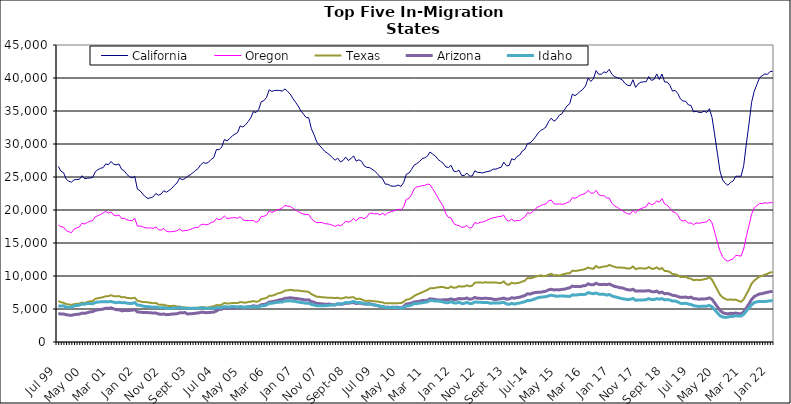
| Category | California | Oregon | Texas | Arizona | Idaho |
|---|---|---|---|---|---|
| Jul 99 | 26605 | 17749 | 6209 | 4339 | 5471 |
| Aug 99 | 25882 | 17447 | 6022 | 4228 | 5444 |
| Sep 99 | 25644 | 17401 | 5941 | 4237 | 5488 |
| Oct 99 | 24669 | 16875 | 5751 | 4134 | 5279 |
| Nov 99 | 24353 | 16701 | 5680 | 4073 | 5260 |
| Dec 99 | 24218 | 16570 | 5619 | 4042 | 5269 |
| Jan 00 | 24574 | 17109 | 5736 | 4142 | 5485 |
| Feb 00 | 24620 | 17295 | 5789 | 4192 | 5530 |
| Mar 00 | 24655 | 17436 | 5826 | 4226 | 5590 |
| Apr 00 | 25195 | 18009 | 5980 | 4375 | 5748 |
| May 00 | 24730 | 17875 | 5897 | 4337 | 5729 |
| Jun 00 | 24825 | 18113 | 6070 | 4444 | 5853 |
| Jul 00 | 24857 | 18294 | 6163 | 4555 | 5824 |
| Aug 00 | 24913 | 18376 | 6199 | 4603 | 5788 |
| Sep 00 | 25792 | 18971 | 6529 | 4804 | 5976 |
| Oct 00 | 26106 | 19135 | 6643 | 4870 | 6058 |
| Nov 00 | 26315 | 19306 | 6705 | 4926 | 6085 |
| Dec 00 | 26415 | 19570 | 6793 | 4991 | 6096 |
| Jan 01 | 26995 | 19781 | 6942 | 5122 | 6119 |
| Feb 01 | 26851 | 19519 | 6948 | 5089 | 6090 |
| Mar 01 | 27352 | 19720 | 7080 | 5180 | 6143 |
| Apr 01 | 26918 | 19221 | 6943 | 5020 | 6020 |
| May 01 | 26848 | 19126 | 6924 | 4899 | 5950 |
| Jun 01 | 26974 | 19241 | 6959 | 4895 | 6019 |
| Jul 01 | 26172 | 18725 | 6778 | 4737 | 5951 |
| Aug 01 | 25943 | 18736 | 6810 | 4757 | 5973 |
| Sep 01 | 25399 | 18514 | 6688 | 4753 | 5895 |
| Oct 01 | 25050 | 18415 | 6650 | 4780 | 5833 |
| Nov 01 | 24873 | 18381 | 6631 | 4826 | 5850 |
| Dec 01 | 25099 | 18765 | 6708 | 4898 | 5969 |
| Jan 02 | 23158 | 17561 | 6261 | 4560 | 5595 |
| Feb 02 | 22926 | 17573 | 6162 | 4531 | 5560 |
| Mar 02 | 22433 | 17452 | 6052 | 4481 | 5458 |
| Apr 02 | 22012 | 17314 | 6046 | 4458 | 5380 |
| May 02 | 21733 | 17267 | 6007 | 4452 | 5358 |
| Jun 02 | 21876 | 17298 | 5933 | 4444 | 5315 |
| Jul 02 | 21997 | 17209 | 5873 | 4383 | 5243 |
| Aug 02 | 22507 | 17436 | 5929 | 4407 | 5315 |
| Sep 02 | 22244 | 17010 | 5672 | 4248 | 5192 |
| Oct 02 | 22406 | 16952 | 5625 | 4191 | 5167 |
| Nov 02 | 22922 | 17223 | 5663 | 4242 | 5221 |
| Dec 02 | 22693 | 16770 | 5499 | 4142 | 5120 |
| Jan 03 | 22964 | 16694 | 5463 | 4166 | 5089 |
| Feb 03 | 23276 | 16727 | 5461 | 4226 | 5077 |
| Mar 03 | 23736 | 16766 | 5486 | 4251 | 5145 |
| Apr 03 | 24079 | 16859 | 5389 | 4289 | 5145 |
| May 03 | 24821 | 17117 | 5378 | 4415 | 5254 |
| Jun 03 | 24592 | 16812 | 5273 | 4426 | 5135 |
| Jul 03 | 24754 | 16875 | 5226 | 4466 | 5124 |
| Aug 03 | 25092 | 16922 | 5181 | 4244 | 5100 |
| Sep 03 | 25316 | 17036 | 5181 | 4279 | 5086 |
| Oct 03 | 25622 | 17228 | 5139 | 4301 | 5110 |
| Nov 03 | 25984 | 17335 | 5175 | 4362 | 5091 |
| Dec 03 | 26269 | 17350 | 5189 | 4396 | 5113 |
| Jan 04 | 26852 | 17734 | 5255 | 4492 | 5152 |
| Feb 04 | 27184 | 17860 | 5301 | 4502 | 5183 |
| Mar 04 | 27062 | 17757 | 5227 | 4443 | 5056 |
| Apr 04 | 27238 | 17840 | 5227 | 4461 | 5104 |
| May 04 | 27671 | 18113 | 5345 | 4493 | 5095 |
| Jun 04 | 27949 | 18201 | 5416 | 4532 | 5103 |
| Jul 04 | 29172 | 18727 | 5597 | 4697 | 5231 |
| Aug 04 | 29122 | 18529 | 5561 | 4945 | 5197 |
| Sep 04 | 29542 | 18678 | 5656 | 4976 | 5237 |
| Oct 04 | 30674 | 19108 | 5922 | 5188 | 5363 |
| Nov 04 | 30472 | 18716 | 5823 | 5106 | 5321 |
| Dec 04 | 30831 | 18755 | 5838 | 5135 | 5312 |
| Jan 05 | 31224 | 18823 | 5906 | 5155 | 5374 |
| Feb 05 | 31495 | 18842 | 5898 | 5168 | 5357 |
| Mar 05 | 31714 | 18738 | 5894 | 5212 | 5313 |
| Apr 05 | 32750 | 18998 | 6060 | 5340 | 5350 |
| May 05 | 32575 | 18504 | 5989 | 5269 | 5276 |
| Jun 05 | 32898 | 18414 | 5954 | 5252 | 5271 |
| Jul 05 | 33384 | 18395 | 6062 | 5322 | 5322 |
| Aug 05 | 33964 | 18381 | 6113 | 5375 | 5316 |
| Sep 05 | 34897 | 18426 | 6206 | 5493 | 5362 |
| Oct 05 | 34780 | 18132 | 6100 | 5408 | 5308 |
| Nov 05 | 35223 | 18332 | 6162 | 5434 | 5314 |
| Dec 05 | 36415 | 19047 | 6508 | 5658 | 5487 |
| Jan 06 | 36567 | 19032 | 6576 | 5688 | 5480 |
| Feb 06 | 37074 | 19257 | 6692 | 5792 | 5616 |
| Mar 06 | 38207 | 19845 | 6993 | 6052 | 5850 |
| Apr 06 | 37976 | 19637 | 7024 | 6101 | 5864 |
| May 06 | 38099 | 19781 | 7114 | 6178 | 5943 |
| Jun 06 | 38141 | 20061 | 7331 | 6276 | 6018 |
| Jul 06 | 38097 | 20111 | 7431 | 6399 | 6046 |
| Aug 06 | 38021 | 20333 | 7542 | 6450 | 6064 |
| Sep 06 | 38349 | 20686 | 7798 | 6627 | 6232 |
| Oct 06 | 37947 | 20591 | 7825 | 6647 | 6216 |
| Nov 06 | 37565 | 20526 | 7907 | 6707 | 6244 |
| Dec 06 | 36884 | 20272 | 7840 | 6648 | 6192 |
| Jan 07 | 36321 | 19984 | 7789 | 6597 | 6151 |
| Feb 07 | 35752 | 19752 | 7799 | 6554 | 6048 |
| Mar 07 | 35025 | 19547 | 7737 | 6487 | 5989 |
| Apr 07 | 34534 | 19412 | 7685 | 6430 | 5937 |
| May 07 | 34022 | 19296 | 7654 | 6353 | 5858 |
| Jun 07 | 33974 | 19318 | 7577 | 6390 | 5886 |
| Jul 07 | 32298 | 18677 | 7250 | 6117 | 5682 |
| Aug 07 | 31436 | 18322 | 7070 | 6034 | 5617 |
| Sep 07 | 30331 | 18087 | 6853 | 5847 | 5500 |
| Oct 07 | 29813 | 18108 | 6839 | 5821 | 5489 |
| Nov 07 | 29384 | 18105 | 6777 | 5769 | 5481 |
| Dec 07 | 28923 | 17949 | 6760 | 5733 | 5499 |
| Jan 08 | 28627 | 17890 | 6721 | 5732 | 5521 |
| Feb 08 | 28328 | 17834 | 6719 | 5749 | 5579 |
| Mar 08 | 27911 | 17680 | 6690 | 5650 | 5614 |
| Apr 08 | 27543 | 17512 | 6656 | 5612 | 5635 |
| May 08 | 27856 | 17754 | 6705 | 5774 | 5798 |
| Jun 08 | 27287 | 17589 | 6593 | 5717 | 5745 |
| Jul 08 | 27495 | 17834 | 6623 | 5761 | 5807 |
| Aug 08 | 28018 | 18309 | 6789 | 5867 | 5982 |
| Sep-08 | 27491 | 18164 | 6708 | 5864 | 5954 |
| Oct 08 | 27771 | 18291 | 6755 | 5942 | 6032 |
| Nov 08 | 28206 | 18706 | 6787 | 5970 | 6150 |
| Dec 08 | 27408 | 18353 | 6505 | 5832 | 5975 |
| Jan 09 | 27601 | 18778 | 6569 | 5890 | 5995 |
| Feb 09 | 27394 | 18863 | 6483 | 5845 | 5936 |
| Mar 09 | 26690 | 18694 | 6273 | 5751 | 5806 |
| Apr 09 | 26461 | 18943 | 6222 | 5735 | 5777 |
| May 09 | 26435 | 19470 | 6272 | 5819 | 5767 |
| Jun 09 | 26187 | 19522 | 6199 | 5700 | 5649 |
| Jul 09 | 25906 | 19408 | 6171 | 5603 | 5617 |
| Aug 09 | 25525 | 19469 | 6128 | 5533 | 5540 |
| Sep 09 | 25050 | 19249 | 6059 | 5405 | 5437 |
| Oct 09 | 24741 | 19529 | 6004 | 5349 | 5369 |
| Nov 09 | 23928 | 19187 | 5854 | 5271 | 5248 |
| Dec 09 | 23899 | 19607 | 5886 | 5261 | 5195 |
| Jan 10 | 23676 | 19703 | 5881 | 5232 | 5234 |
| Feb 10 | 23592 | 19845 | 5850 | 5272 | 5236 |
| Mar 10 | 23634 | 19946 | 5864 | 5278 | 5219 |
| Apr 10 | 23774 | 20134 | 5889 | 5257 | 5201 |
| May 10 | 23567 | 19966 | 5897 | 5172 | 5105 |
| Jun 10 | 24166 | 20464 | 6087 | 5356 | 5237 |
| Jul 10 | 25410 | 21627 | 6417 | 5742 | 5452 |
| Aug 10 | 25586 | 21744 | 6465 | 5797 | 5491 |
| Sep 10 | 26150 | 22314 | 6667 | 5907 | 5609 |
| Oct 10 | 26807 | 23219 | 6986 | 6070 | 5831 |
| Nov 10 | 27033 | 23520 | 7179 | 6100 | 5810 |
| Dec 10 | 27332 | 23551 | 7361 | 6182 | 5898 |
| Jan 11 | 27769 | 23697 | 7525 | 6276 | 5938 |
| Feb 11 | 27898 | 23718 | 7708 | 6267 | 6016 |
| Mar 11 | 28155 | 23921 | 7890 | 6330 | 6081 |
| Apr 11 | 28790 | 23847 | 8146 | 6544 | 6305 |
| May 11 | 28471 | 23215 | 8131 | 6502 | 6248 |
| Jun 11 | 28191 | 22580 | 8199 | 6445 | 6217 |
| Jul 11 | 27678 | 21867 | 8291 | 6368 | 6202 |
| Aug 11 | 27372 | 21203 | 8321 | 6356 | 6146 |
| Sep 11 | 27082 | 20570 | 8341 | 6387 | 6075 |
| Oct 11 | 26528 | 19442 | 8191 | 6402 | 5932 |
| Nov 11 | 26440 | 18872 | 8176 | 6426 | 5968 |
| Dec 11 | 26770 | 18784 | 8401 | 6533 | 6106 |
| Jan 12 | 25901 | 17963 | 8202 | 6390 | 5933 |
| Feb 12 | 25796 | 17718 | 8266 | 6456 | 5900 |
| Mar 12 | 26042 | 17647 | 8456 | 6600 | 6054 |
| Apr 12 | 25239 | 17386 | 8388 | 6534 | 5838 |
| May 12 | 25238 | 17407 | 8401 | 6558 | 5854 |
| Jun 12 | 25593 | 17673 | 8594 | 6669 | 6009 |
| Jul 12 | 25155 | 17237 | 8432 | 6474 | 5817 |
| Aug 12 | 25146 | 17391 | 8536 | 6539 | 5842 |
| Sep 12 | 25942 | 18102 | 8989 | 6759 | 6061 |
| Oct 12 | 25718 | 17953 | 9012 | 6618 | 6027 |
| Nov 12 | 25677 | 18134 | 9032 | 6611 | 6009 |
| Dec 12 | 25619 | 18166 | 8981 | 6601 | 5999 |
| Jan 13 | 25757 | 18344 | 9051 | 6627 | 5989 |
| Feb-13 | 25830 | 18512 | 9001 | 6606 | 5968 |
| Mar-13 | 25940 | 18689 | 9021 | 6577 | 5853 |
| Apr 13 | 26187 | 18844 | 9013 | 6478 | 5925 |
| May 13 | 26192 | 18884 | 9003 | 6431 | 5924 |
| Jun-13 | 26362 | 19013 | 8948 | 6508 | 5896 |
| Jul 13 | 26467 | 19037 | 8958 | 6559 | 5948 |
| Aug 13 | 27253 | 19198 | 9174 | 6655 | 6020 |
| Sep 13 | 26711 | 18501 | 8747 | 6489 | 5775 |
| Oct 13 | 26733 | 18301 | 8681 | 6511 | 5711 |
| Nov 13 | 27767 | 18620 | 8989 | 6709 | 5860 |
| Dec 13 | 27583 | 18320 | 8863 | 6637 | 5740 |
| Jan 14 | 28107 | 18409 | 8939 | 6735 | 5843 |
| Feb-14 | 28313 | 18383 | 8989 | 6779 | 5893 |
| Mar 14 | 28934 | 18696 | 9160 | 6918 | 6015 |
| Apr 14 | 29192 | 18946 | 9291 | 7036 | 6099 |
| May 14 | 30069 | 19603 | 9701 | 7314 | 6304 |
| Jun 14 | 30163 | 19487 | 9641 | 7252 | 6293 |
| Jul-14 | 30587 | 19754 | 9752 | 7415 | 6427 |
| Aug-14 | 31074 | 20201 | 9882 | 7499 | 6557 |
| Sep 14 | 31656 | 20459 | 9997 | 7536 | 6719 |
| Oct 14 | 32037 | 20663 | 10109 | 7555 | 6786 |
| Nov 14 | 32278 | 20825 | 9992 | 7628 | 6831 |
| Dec 14 | 32578 | 20918 | 10006 | 7705 | 6860 |
| Jan 15 | 33414 | 21396 | 10213 | 7906 | 7000 |
| Feb 15 | 33922 | 21518 | 10337 | 7982 | 7083 |
| Mar 15 | 33447 | 20942 | 10122 | 7891 | 7006 |
| Apr-15 | 33731 | 20893 | 10138 | 7906 | 6931 |
| May 15 | 34343 | 20902 | 10053 | 7895 | 6952 |
| Jun-15 | 34572 | 20870 | 10192 | 7973 | 6966 |
| Jul 15 | 35185 | 20916 | 10303 | 8000 | 6949 |
| Aug 15 | 35780 | 21115 | 10399 | 8126 | 6938 |
| Sep 15 | 36109 | 21246 | 10428 | 8207 | 6896 |
| Oct 15 | 37555 | 21908 | 10813 | 8477 | 7140 |
| Nov 15 | 37319 | 21750 | 10763 | 8390 | 7112 |
| Dec 15 | 37624 | 21990 | 10807 | 8395 | 7149 |
| Jan 16 | 37978 | 22248 | 10892 | 8388 | 7201 |
| Feb 16 | 38285 | 22369 | 10951 | 8508 | 7192 |
| Mar 16 | 38792 | 22506 | 11075 | 8547 | 7226 |
| Apr 16 | 39994 | 22999 | 11286 | 8815 | 7487 |
| May 16 | 39488 | 22548 | 11132 | 8673 | 7382 |
| Jun 16 | 39864 | 22556 | 11100 | 8682 | 7315 |
| Jul 16 | 41123 | 22989 | 11516 | 8903 | 7420 |
| Aug 16 | 40573 | 22333 | 11251 | 8731 | 7261 |
| Sep 16 | 40560 | 22162 | 11340 | 8692 | 7216 |
| Oct 16 | 40923 | 22172 | 11456 | 8742 | 7233 |
| Nov 16 | 40817 | 21818 | 11459 | 8685 | 7101 |
| Dec 16 | 41311 | 21815 | 11681 | 8783 | 7203 |
| Jan 17 | 40543 | 21029 | 11524 | 8609 | 6982 |
| Feb 17 | 40218 | 20613 | 11385 | 8416 | 6852 |
| Mar 17 | 40052 | 20425 | 11276 | 8354 | 6775 |
| Apr 17 | 39913 | 20147 | 11297 | 8218 | 6653 |
| May 17 | 39695 | 19910 | 11265 | 8196 | 6552 |
| Jun 17 | 39177 | 19650 | 11225 | 8034 | 6500 |
| Jul 17 | 38901 | 19419 | 11115 | 7923 | 6429 |
| Aug 17 | 38827 | 19389 | 11168 | 7867 | 6479 |
| Sep 17 | 39736 | 19936 | 11426 | 7991 | 6609 |
| Oct 17 | 38576 | 19547 | 11041 | 7708 | 6315 |
| Nov 17 | 39108 | 20013 | 11158 | 7746 | 6381 |
| Dec 17 | 39359 | 20202 | 11185 | 7743 | 6366 |
| Jan 18 | 39420 | 20362 | 11118 | 7736 | 6380 |
| Feb 18 | 39440 | 20476 | 11128 | 7741 | 6407 |
| Mar 18 | 40218 | 21106 | 11362 | 7789 | 6578 |
| Apr 18 | 39637 | 20788 | 11111 | 7642 | 6423 |
| May 18 | 39777 | 20933 | 11097 | 7591 | 6430 |
| Jun 18 | 40602 | 21381 | 11317 | 7721 | 6554 |
| Jul 18 | 39767 | 21189 | 11038 | 7445 | 6489 |
| Aug 18 | 40608 | 21729 | 11200 | 7560 | 6569 |
| Sep 18 | 39395 | 20916 | 10772 | 7318 | 6383 |
| Oct 18 | 39383 | 20724 | 10740 | 7344 | 6429 |
| Nov 18 | 38891 | 20265 | 10605 | 7255 | 6365 |
| Dec 18 | 38013 | 19741 | 10292 | 7069 | 6205 |
| Jan 19 | 38130 | 19643 | 10261 | 7032 | 6203 |
| Feb 19 | 37658 | 19237 | 10132 | 6892 | 6073 |
| Mar 19 | 36831 | 18492 | 9848 | 6766 | 5863 |
| Apr 19 | 36492 | 18349 | 9839 | 6763 | 5827 |
| May 19 | 36481 | 18407 | 9867 | 6809 | 5873 |
| Jun 19 | 35925 | 17998 | 9661 | 6698 | 5761 |
| Jul 19 | 35843 | 18049 | 9598 | 6800 | 5673 |
| Aug 19 | 34870 | 17785 | 9361 | 6577 | 5512 |
| Sep 19 | 34945 | 18038 | 9428 | 6547 | 5437 |
| Oct 19 | 34802 | 17977 | 9385 | 6483 | 5390 |
| Nov 19 | 34775 | 18072 | 9403 | 6511 | 5401 |
| Dec 19 | 34976 | 18140 | 9518 | 6521 | 5419 |
| Jan 20 | 34774 | 18209 | 9594 | 6561 | 5434 |
| Feb 20 | 35352 | 18632 | 9804 | 6682 | 5543 |
| Mar 20 | 34013 | 18041 | 9411 | 6464 | 5330 |
| Apr 20 | 31385 | 16629 | 8666 | 5922 | 4906 |
| May 20 | 28657 | 15123 | 7927 | 5355 | 4419 |
| Jun 20 | 25915 | 13817 | 7164 | 4815 | 3992 |
| Jul 20 | 24545 | 12926 | 6776 | 4457 | 3810 |
| Aug 20 | 24048 | 12443 | 6521 | 4326 | 3720 |
| Sep 20 | 23756 | 12258 | 6386 | 4266 | 3784 |
| Oct 20 | 24166 | 12429 | 6452 | 4347 | 3861 |
| Nov 20 | 24404 | 12597 | 6386 | 4324 | 3883 |
| Dec 20 | 25120 | 13122 | 6420 | 4394 | 3974 |
| Jan 21 | 25111 | 13080 | 6236 | 4304 | 3924 |
| Feb 21 | 25114 | 13015 | 6094 | 4260 | 3930 |
| Mar 21 | 26701 | 14096 | 6455 | 4567 | 4185 |
| Apr 21 | 29998 | 15978 | 7222 | 5164 | 4697 |
| May 21 | 33020 | 17641 | 7969 | 5748 | 5148 |
| Jun 21 | 36320 | 19369 | 8840 | 6450 | 5628 |
| Jul 21 | 37989 | 20320 | 9306 | 6877 | 5984 |
| Aug 21 | 39007 | 20657 | 9615 | 7094 | 6084 |
| Sep 21 | 40023 | 20974 | 9914 | 7277 | 6151 |
| Oct 21 | 40348 | 20966 | 10003 | 7327 | 6140 |
| Nov 21 | 40599 | 21096 | 10203 | 7437 | 6136 |
| Dec 21 | 40548 | 21032 | 10328 | 7532 | 6183 |
| Jan 22 | 40967 | 21106 | 10535 | 7618 | 6237 |
| Feb 22 | 41019 | 21125 | 10579 | 7673 | 6236 |